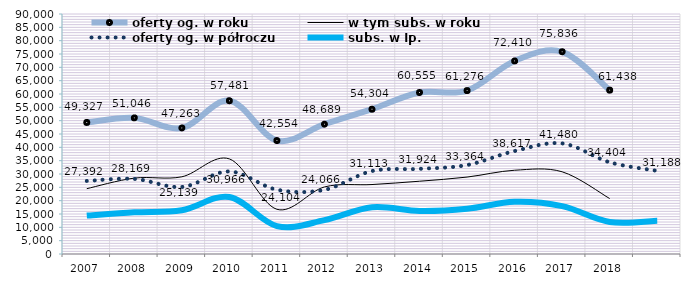
| Category | oferty og. w roku | w tym subs. w roku | oferty og. w półroczu | subs. w Ip. |
|---|---|---|---|---|
| 2007.0 | 49327 | 24494 | 27392 | 14414 |
| 2008.0 | 51046 | 28458 | 28169 | 15639 |
| 2009.0 | 47263 | 28957 | 25139 | 16435 |
| 2010.0 | 57481 | 35663 | 30966 | 21368 |
| 2011.0 | 42554 | 16768 | 24104 | 10464 |
| 2012.0 | 48689 | 25146 | 24066 | 12684 |
| 2013.0 | 54304 | 26050 | 31113 | 17521 |
| 2014.0 | 60555 | 27292 | 31924 | 16121 |
| 2015.0 | 61276 | 28848 | 33364 | 16952 |
| 2016.0 | 72410 | 31407 | 38617 | 19558 |
| 2017.0 | 75836 | 30828 | 41480 | 17945 |
| 2018.0 | 61438 | 20784 | 34404 | 12024 |